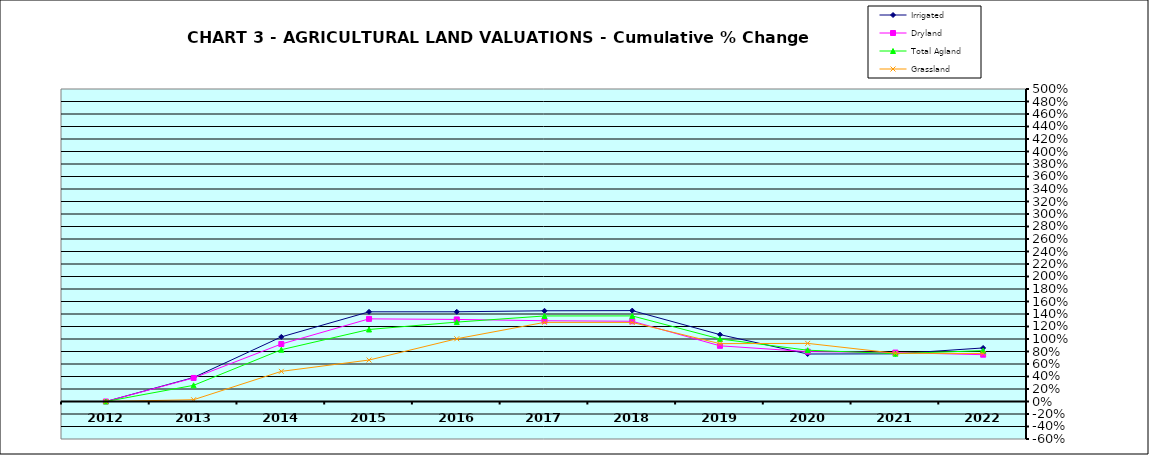
| Category | Irrigated | Dryland | Total Agland | Grassland |
|---|---|---|---|---|
| 2012.0 | 0 | 0 | 0 | 0 |
| 2013.0 | 0.384 | 0.377 | 0.259 | 0.029 |
| 2014.0 | 1.034 | 0.92 | 0.829 | 0.482 |
| 2015.0 | 1.435 | 1.322 | 1.152 | 0.663 |
| 2016.0 | 1.436 | 1.313 | 1.27 | 1.004 |
| 2017.0 | 1.451 | 1.292 | 1.369 | 1.266 |
| 2018.0 | 1.454 | 1.284 | 1.369 | 1.265 |
| 2019.0 | 1.07 | 0.891 | 1.001 | 0.926 |
| 2020.0 | 0.76 | 0.798 | 0.821 | 0.93 |
| 2021.0 | 0.762 | 0.783 | 0.766 | 0.772 |
| 2022.0 | 0.857 | 0.749 | 0.814 | 0.768 |